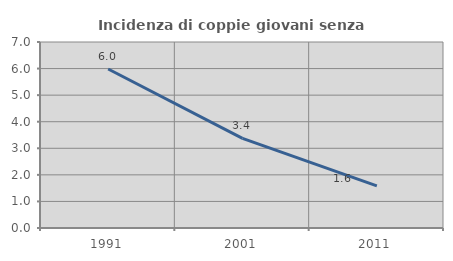
| Category | Incidenza di coppie giovani senza figli |
|---|---|
| 1991.0 | 5.983 |
| 2001.0 | 3.376 |
| 2011.0 | 1.587 |